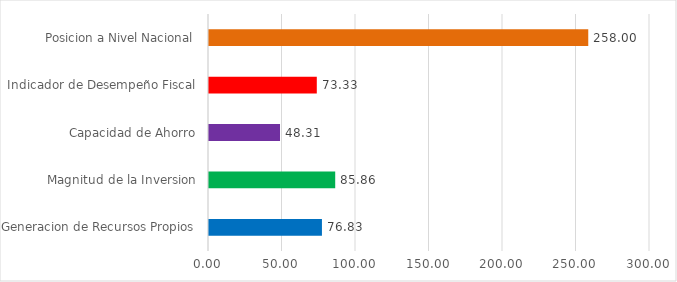
| Category | Series 0 |
|---|---|
| Generacion de Recursos Propios | 76.83 |
| Magnitud de la Inversion | 85.86 |
| Capacidad de Ahorro | 48.31 |
| Indicador de Desempeño Fiscal | 73.33 |
| Posicion a Nivel Nacional | 258 |